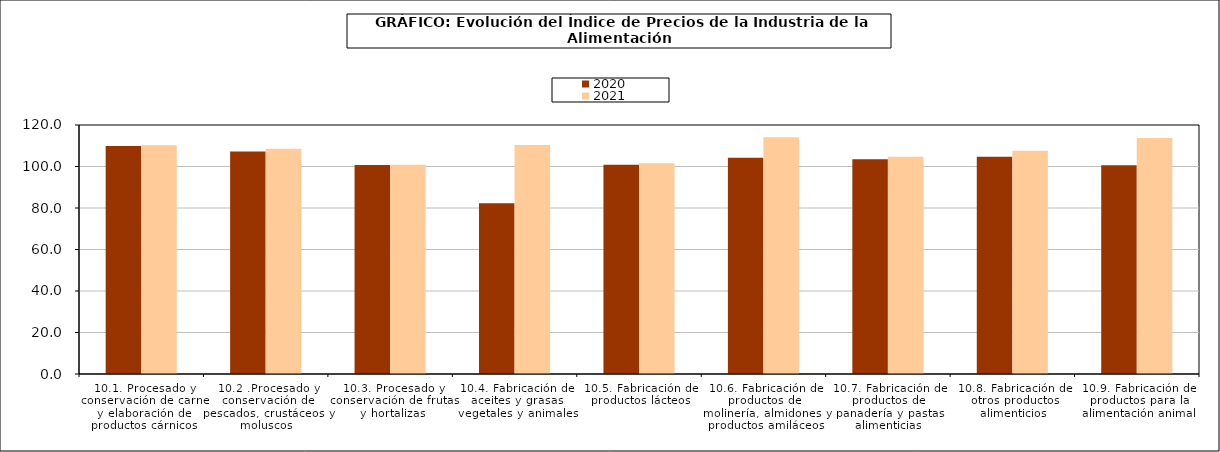
| Category | 2020 | 2021 |
|---|---|---|
| 10.1. Procesado y conservación de carne y elaboración de productos cárnicos | 109.903 | 110.199 |
| 10.2 .Procesado y conservación de pescados, crustáceos y moluscos | 107.265 | 108.541 |
| 10.3. Procesado y conservación de frutas y hortalizas | 100.766 | 100.9 |
| 10.4. Fabricación de aceites y grasas vegetales y animales | 82.257 | 110.373 |
| 10.5. Fabricación de productos lácteos | 100.848 | 101.515 |
| 10.6. Fabricación de productos de molinería, almidones y productos amiláceos | 104.237 | 114.043 |
| 10.7. Fabricación de productos de panadería y pastas alimenticias | 103.53 | 104.723 |
| 10.8. Fabricación de otros productos alimenticios | 104.646 | 107.551 |
| 10.9. Fabricación de productos para la alimentación animal | 100.554 | 113.778 |